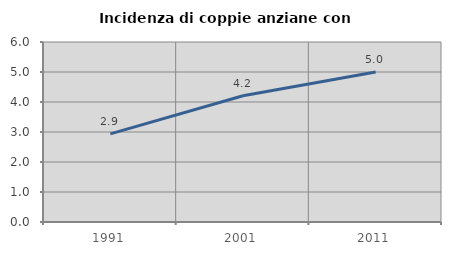
| Category | Incidenza di coppie anziane con figli |
|---|---|
| 1991.0 | 2.936 |
| 2001.0 | 4.209 |
| 2011.0 | 5.003 |